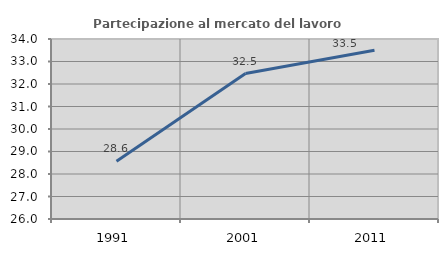
| Category | Partecipazione al mercato del lavoro  femminile |
|---|---|
| 1991.0 | 28.571 |
| 2001.0 | 32.464 |
| 2011.0 | 33.503 |